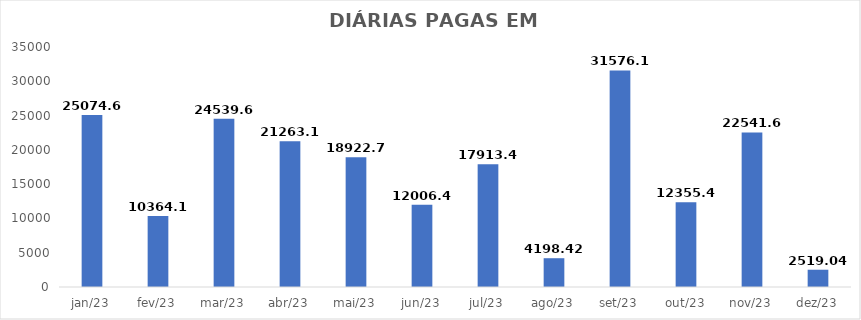
| Category | Total |
|---|---|
| jan/23 | 25074.64 |
| fev/23 | 10364.1 |
| mar/23 | 24539.68 |
| abr/23 | 21263.18 |
| mai/23 | 18922.78 |
| jun/23 | 12006.42 |
| jul/23 | 17913.42 |
| ago/23 | 4198.42 |
| set/23 | 31576.18 |
| out/23 | 12355.4 |
| nov/23 | 22541.68 |
| dez/23 | 2519.04 |